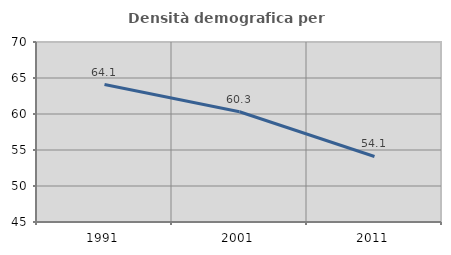
| Category | Densità demografica |
|---|---|
| 1991.0 | 64.087 |
| 2001.0 | 60.319 |
| 2011.0 | 54.103 |